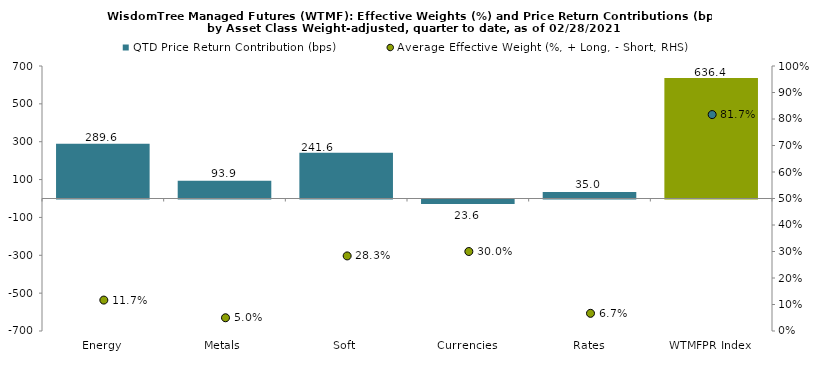
| Category | QTD Price Return Contribution (bps) |
|---|---|
| Energy | 289.561 |
| Metals | 93.87 |
| Soft | 241.557 |
| Currencies | -23.556 |
| Rates | 34.993 |
| WTMFPR Index | 636.425 |